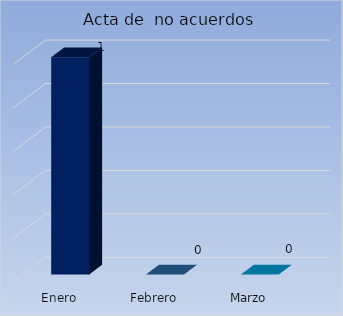
| Category | Acta de  no acuerdos |
|---|---|
| Enero | 1 |
| Febrero | 0 |
| Marzo | 0 |